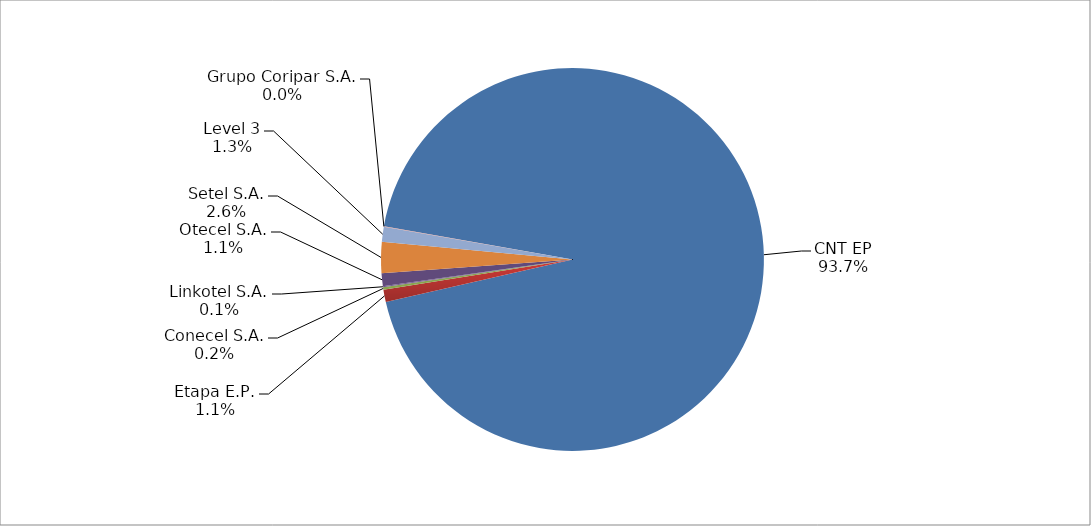
| Category | Series 0 |
|---|---|
| CNT EP | 2317 |
| Etapa E.P. | 26 |
| Conecel S.A. | 5 |
| Linkotel S.A. | 2 |
| Otecel S.A. | 27 |
| Setel S.A. | 65 |
| Level 3 | 31 |
| Grupo Coripar S.A. | 1 |